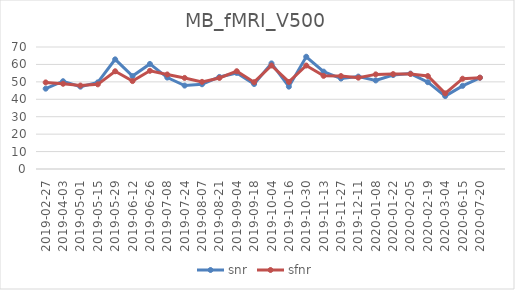
| Category | snr | sfnr |
|---|---|---|
| 2019-02-27 | 46.099 | 49.675 |
| 2019-04-03 | 50.358 | 48.905 |
| 2019-05-01 | 47.243 | 47.873 |
| 2019-05-15 | 49.707 | 48.575 |
| 2019-05-29 | 62.908 | 56.077 |
| 2019-06-12 | 53.31 | 50.439 |
| 2019-06-26 | 60.285 | 56.342 |
| 2019-07-08 | 52.454 | 54.242 |
| 2019-07-24 | 47.863 | 52.256 |
| 2019-08-07 | 48.623 | 49.999 |
| 2019-08-21 | 52.822 | 52.238 |
| 2019-09-04 | 55.11 | 56.106 |
| 2019-09-18 | 48.754 | 49.803 |
| 2019-10-04 | 60.599 | 59.389 |
| 2019-10-16 | 47.256 | 49.949 |
| 2019-10-30 | 64.409 | 59.371 |
| 2019-11-13 | 55.863 | 53.445 |
| 2019-11-27 | 51.898 | 53.321 |
| 2019-12-11 | 53.028 | 52.409 |
| 2020-01-08 | 50.811 | 54.29 |
| 2020-01-22 | 53.898 | 54.437 |
| 2020-02-05 | 54.725 | 54.536 |
| 2020-02-19 | 49.814 | 53.339 |
| 2020-03-04 | 41.839 | 43.399 |
| 2020-06-15 | 47.695 | 51.802 |
| 2020-07-20 | 52.34 | 52.42 |